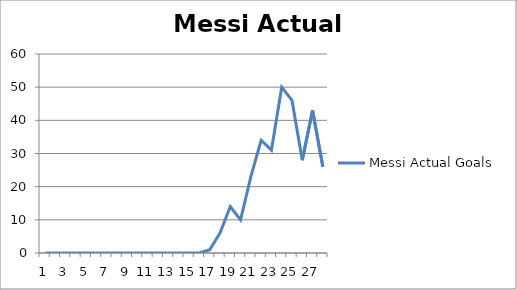
| Category | Messi Actual Goals  |
|---|---|
| 0 | 0 |
| 1 | 0 |
| 2 | 0 |
| 3 | 0 |
| 4 | 0 |
| 5 | 0 |
| 6 | 0 |
| 7 | 0 |
| 8 | 0 |
| 9 | 0 |
| 10 | 0 |
| 11 | 0 |
| 12 | 0 |
| 13 | 0 |
| 14 | 0 |
| 15 | 0 |
| 16 | 1 |
| 17 | 6 |
| 18 | 14 |
| 19 | 10 |
| 20 | 23 |
| 21 | 34 |
| 22 | 31 |
| 23 | 50 |
| 24 | 46 |
| 25 | 28 |
| 26 | 43 |
| 27 | 26 |